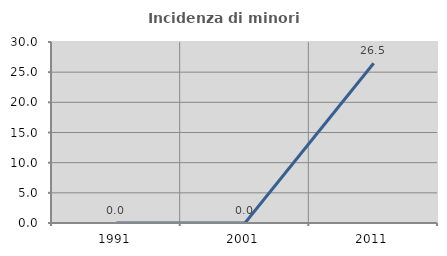
| Category | Incidenza di minori stranieri |
|---|---|
| 1991.0 | 0 |
| 2001.0 | 0 |
| 2011.0 | 26.471 |